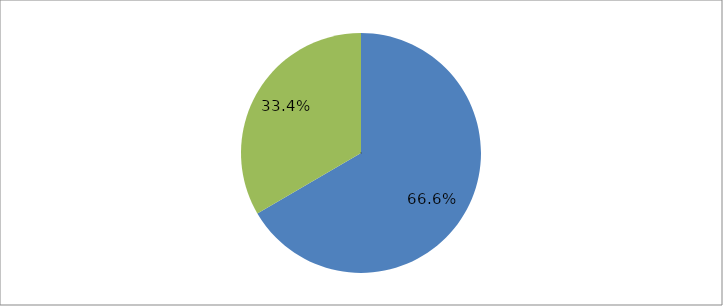
| Category | Series 0 |
|---|---|
| 0 | 0.666 |
| 1 | 0.334 |